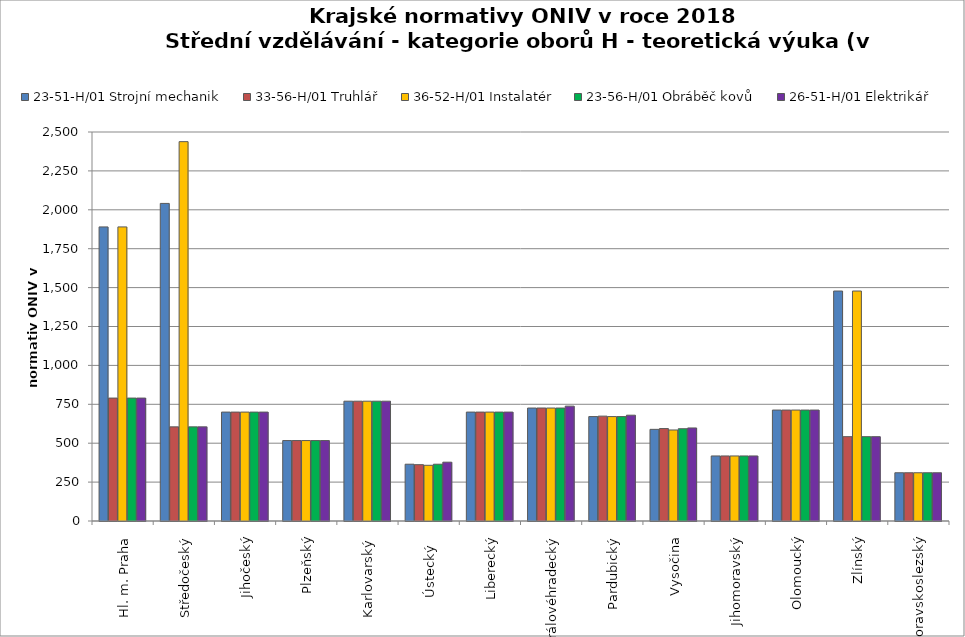
| Category | 23-51-H/01 Strojní mechanik | 33-56-H/01 Truhlář | 36-52-H/01 Instalatér | 23-56-H/01 Obráběč kovů | 26-51-H/01 Elektrikář |
|---|---|---|---|---|---|
| Hl. m. Praha | 1890 | 790 | 1890 | 790 | 790 |
| Středočeský | 2041 | 605 | 2438 | 605 | 605 |
| Jihočeský | 700 | 700 | 700 | 700 | 700 |
| Plzeňský | 517 | 517 | 517 | 517 | 517 |
| Karlovarský  | 770 | 770 | 770 | 770 | 770 |
| Ústecký   | 365 | 362 | 358 | 365 | 378 |
| Liberecký | 700 | 700 | 700 | 700 | 700 |
| Královéhradecký | 726 | 726.2 | 726 | 726 | 738.2 |
| Pardubický | 671 | 674 | 671 | 671 | 680 |
| Vysočina | 589 | 594 | 585 | 593 | 598 |
| Jihomoravský | 418 | 418 | 418 | 418 | 418 |
| Olomoucký | 713 | 713 | 713 | 713 | 713 |
| Zlínský | 1478 | 542 | 1478 | 542 | 542 |
| Moravskoslezský | 310 | 310 | 310 | 310 | 310 |